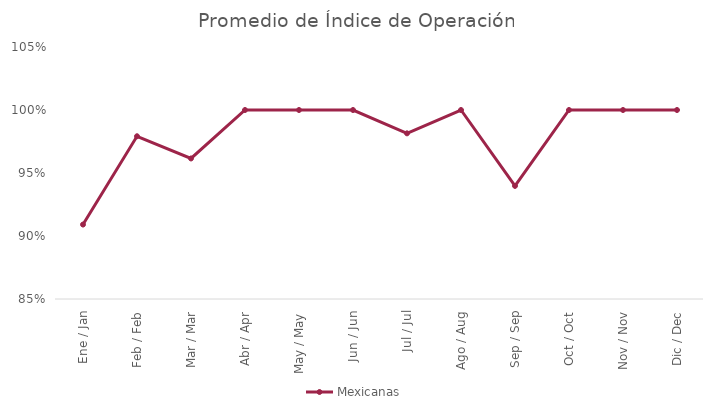
| Category | Mexicanas |
|---|---|
| Ene / Jan | 0.909 |
| Feb / Feb | 0.979 |
| Mar / Mar | 0.962 |
| Abr / Apr | 1 |
| May / May | 1 |
| Jun / Jun | 1 |
| Jul / Jul | 0.981 |
| Ago / Aug | 1 |
| Sep / Sep | 0.94 |
| Oct / Oct | 1 |
| Nov / Nov | 1 |
| Dic / Dec | 1 |